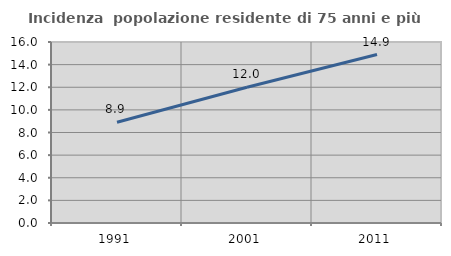
| Category | Incidenza  popolazione residente di 75 anni e più |
|---|---|
| 1991.0 | 8.913 |
| 2001.0 | 11.998 |
| 2011.0 | 14.895 |